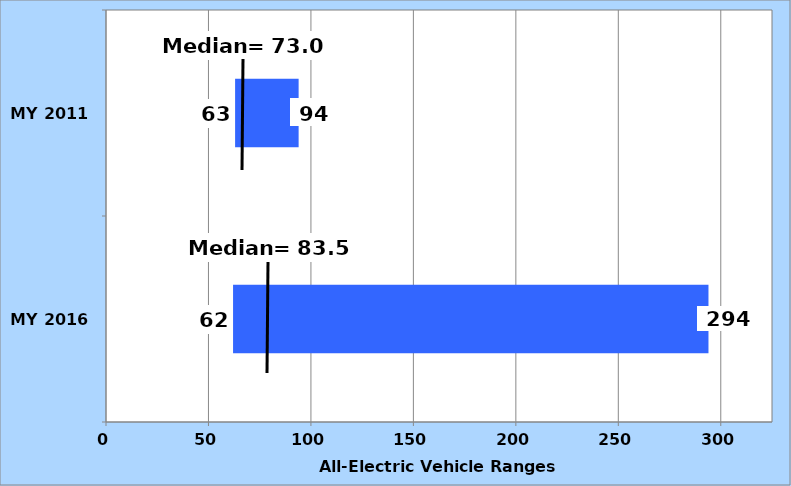
| Category | Series 0 | Series 1 |
|---|---|---|
| MY 2016 | 62 | 232 |
| MY 2011 | 63 | 31 |